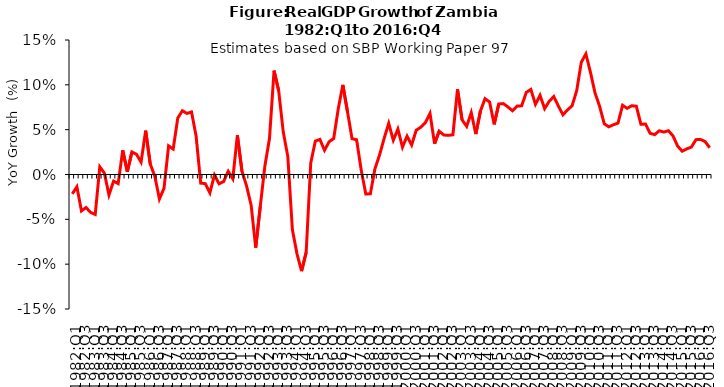
| Category | Series 0 |
|---|---|
| 1982:Q1 | -0.022 |
| 1982:Q2 | -0.014 |
| 1982:Q3 | -0.041 |
| 1982:Q4 | -0.037 |
| 1983:Q1 | -0.042 |
| 1983:Q2 | -0.045 |
| 1983:Q3 | 0.009 |
| 1983:Q4 | 0.001 |
| 1984:Q1 | -0.023 |
| 1984:Q2 | -0.007 |
| 1984:Q3 | -0.01 |
| 1984:Q4 | 0.027 |
| 1985:Q1 | 0.003 |
| 1985:Q2 | 0.025 |
| 1985:Q3 | 0.023 |
| 1985:Q4 | 0.014 |
| 1986:Q1 | 0.049 |
| 1986:Q2 | 0.012 |
| 1986:Q3 | -0.002 |
| 1986:Q4 | -0.027 |
| 1987:Q1 | -0.015 |
| 1987:Q2 | 0.032 |
| 1987:Q3 | 0.028 |
| 1987:Q4 | 0.063 |
| 1988:Q1 | 0.071 |
| 1988:Q2 | 0.068 |
| 1988:Q3 | 0.07 |
| 1988:Q4 | 0.043 |
| 1989:Q1 | -0.01 |
| 1989:Q2 | -0.01 |
| 1989:Q3 | -0.02 |
| 1989:Q4 | -0.001 |
| 1990:Q1 | -0.01 |
| 1990:Q2 | -0.008 |
| 1990:Q3 | 0.004 |
| 1990:Q4 | -0.005 |
| 1991:Q1 | 0.044 |
| 1991:Q2 | 0.004 |
| 1991:Q3 | -0.013 |
| 1991:Q4 | -0.034 |
| 1992:Q1 | -0.081 |
| 1992:Q2 | -0.035 |
| 1992:Q3 | 0.01 |
| 1992:Q4 | 0.04 |
| 1993:Q1 | 0.116 |
| 1993:Q2 | 0.094 |
| 1993:Q3 | 0.048 |
| 1993:Q4 | 0.02 |
| 1994:Q1 | -0.062 |
| 1994:Q2 | -0.088 |
| 1994:Q3 | -0.108 |
| 1994:Q4 | -0.087 |
| 1995:Q1 | 0.013 |
| 1995:Q2 | 0.037 |
| 1995:Q3 | 0.039 |
| 1995:Q4 | 0.027 |
| 1996:Q1 | 0.036 |
| 1996:Q2 | 0.04 |
| 1996:Q3 | 0.073 |
| 1996:Q4 | 0.1 |
| 1997:Q1 | 0.07 |
| 1997:Q2 | 0.04 |
| 1997:Q3 | 0.039 |
| 1997:Q4 | 0.005 |
| 1998:Q1 | -0.022 |
| 1998:Q2 | -0.022 |
| 1998:Q3 | 0.006 |
| 1998:Q4 | 0.022 |
| 1999:Q1 | 0.04 |
| 1999:Q2 | 0.057 |
| 1999:Q3 | 0.038 |
| 1999:Q4 | 0.051 |
| 2000:Q1 | 0.031 |
| 2000:Q2 | 0.043 |
| 2000:Q3 | 0.033 |
| 2000:Q4 | 0.049 |
| 2001:Q1 | 0.053 |
| 2001:Q2 | 0.058 |
| 2001:Q3 | 0.068 |
| 2001:Q4 | 0.034 |
| 2002:Q1 | 0.048 |
| 2002:Q2 | 0.044 |
| 2002:Q3 | 0.044 |
| 2002:Q4 | 0.044 |
| 2003:Q1 | 0.095 |
| 2003:Q2 | 0.061 |
| 2003:Q3 | 0.054 |
| 2003:Q4 | 0.069 |
| 2004:Q1 | 0.045 |
| 2004:Q2 | 0.071 |
| 2004:Q3 | 0.085 |
| 2004:Q4 | 0.081 |
| 2005:Q1 | 0.056 |
| 2005:Q2 | 0.079 |
| 2005:Q3 | 0.079 |
| 2005:Q4 | 0.075 |
| 2006:Q1 | 0.071 |
| 2006:Q2 | 0.076 |
| 2006:Q3 | 0.077 |
| 2006:Q4 | 0.092 |
| 2007:Q1 | 0.095 |
| 2007:Q2 | 0.078 |
| 2007:Q3 | 0.088 |
| 2007:Q4 | 0.073 |
| 2008:Q1 | 0.082 |
| 2008:Q2 | 0.087 |
| 2008:Q3 | 0.076 |
| 2008:Q4 | 0.067 |
| 2009:Q1 | 0.072 |
| 2009:Q2 | 0.077 |
| 2009:Q3 | 0.094 |
| 2009:Q4 | 0.125 |
| 2010:Q1 | 0.135 |
| 2010:Q2 | 0.114 |
| 2010:Q3 | 0.091 |
| 2010:Q4 | 0.076 |
| 2011:Q1 | 0.057 |
| 2011:Q2 | 0.053 |
| 2011:Q3 | 0.055 |
| 2011:Q4 | 0.057 |
| 2012:Q1 | 0.077 |
| 2012:Q2 | 0.074 |
| 2012:Q3 | 0.077 |
| 2012:Q4 | 0.076 |
| 2013:Q1 | 0.056 |
| 2013:Q2 | 0.056 |
| 2013:Q3 | 0.046 |
| 2013:Q4 | 0.044 |
| 2014:Q1 | 0.049 |
| 2014:Q2 | 0.047 |
| 2014:Q3 | 0.049 |
| 2014:Q4 | 0.043 |
| 2015:Q1 | 0.032 |
| 2015:Q2 | 0.026 |
| 2015:Q3 | 0.029 |
| 2015:Q4 | 0.031 |
| 2016:Q1 | 0.039 |
| 2016:Q2 | 0.039 |
| 2016:Q3 | 0.037 |
| 2016:Q4 | 0.03 |